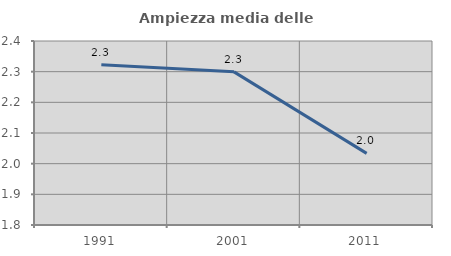
| Category | Ampiezza media delle famiglie |
|---|---|
| 1991.0 | 2.323 |
| 2001.0 | 2.299 |
| 2011.0 | 2.034 |